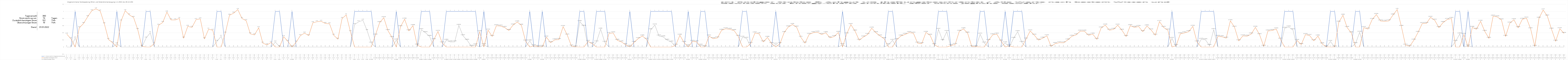
| Category | 1 = Strom reicht im Tagesdurchschnitt aus | Zusätzlich benötigter Strom | Überschüssiger Strom |
|---|---|---|---|
| 0 | 0 | 0.36 | 0 |
| 1 | 0 | 0.23 | 0 |
| 2 | 1 | 0 | 0.25 |
| 3 | 0 | 0.54 | 0 |
| 4 | 0 | 0.66 | 0 |
| 5 | 0 | 0.85 | 0 |
| 6 | 0 | 1.02 | 0 |
| 7 | 0 | 1.07 | 0 |
| 8 | 0 | 1.01 | 0 |
| 9 | 0 | 0.65 | 0 |
| 10 | 0 | 0.21 | 0 |
| 11 | 0 | 0.12 | 0 |
| 12 | 1 | 0 | 0.09 |
| 13 | 0 | 0.73 | 0 |
| 14 | 0 | 1.02 | 0 |
| 15 | 0 | 0.9 | 0 |
| 16 | 0 | 0.83 | 0 |
| 17 | 0 | 0.49 | 0 |
| 18 | 0 | 0.02 | 0 |
| 19 | 1 | 0 | 0.25 |
| 20 | 1 | 0 | 0.4 |
| 21 | 0 | 0.1 | 0 |
| 22 | 0 | 0.61 | 0 |
| 23 | 0 | 0.69 | 0 |
| 24 | 0 | 0.98 | 0 |
| 25 | 0 | 0.76 | 0 |
| 26 | 0 | 0.76 | 0 |
| 27 | 0 | 0.8 | 0 |
| 28 | 0 | 0.25 | 0 |
| 29 | 0 | 0.58 | 0 |
| 30 | 0 | 0.55 | 0 |
| 31 | 0 | 0.77 | 0 |
| 32 | 0 | 0.79 | 0 |
| 33 | 0 | 0.23 | 0 |
| 34 | 0 | 0.5 | 0 |
| 35 | 0 | 0.47 | 0 |
| 36 | 1 | 0 | 0.16 |
| 37 | 1 | 0 | 0.3 |
| 38 | 0 | 0.39 | 0 |
| 39 | 0 | 0.89 | 0 |
| 40 | 0 | 0.95 | 0 |
| 41 | 0 | 1.05 | 0 |
| 42 | 0 | 0.8 | 0 |
| 43 | 0 | 0.74 | 0 |
| 44 | 0 | 0.37 | 0 |
| 45 | 0 | 0.34 | 0 |
| 46 | 0 | 0.54 | 0 |
| 47 | 0 | 0.11 | 0 |
| 48 | 0 | 0.06 | 0 |
| 49 | 0 | 0.13 | 0 |
| 50 | 1 | 0 | 0.14 |
| 51 | 1 | 0 | 0.01 |
| 52 | 0 | 0.29 | 0 |
| 53 | 0 | 0.16 | 0 |
| 54 | 1 | 0 | 0 |
| 55 | 0 | 0.14 | 0 |
| 56 | 0 | 0.32 | 0 |
| 57 | 0 | 0.39 | 0 |
| 58 | 0 | 0.32 | 0 |
| 59 | 0 | 0.68 | 0 |
| 60 | 0 | 0.71 | 0 |
| 61 | 0 | 0.72 | 0 |
| 62 | 0 | 0.66 | 0 |
| 63 | 0 | 0.65 | 0 |
| 64 | 0 | 0.33 | 0 |
| 65 | 0 | 0.22 | 0 |
| 66 | 0 | 0.8 | 0 |
| 67 | 0 | 0.9 | 0 |
| 68 | 0 | 0.43 | 0 |
| 69 | 1 | 0 | 0.63 |
| 70 | 1 | 0 | 0.71 |
| 71 | 1 | 0 | 0.75 |
| 72 | 1 | 0 | 0.46 |
| 73 | 1 | 0 | 0.11 |
| 74 | 0 | 0.335 | 0 |
| 75 | 0 | 0.683 | 0 |
| 76 | 0 | 0.822 | 0 |
| 77 | 0 | 0.459 | 0 |
| 78 | 0 | 0.265 | 0 |
| 79 | 1 | 0 | 0.195 |
| 80 | 0 | 0.568 | 0 |
| 81 | 0 | 0.78 | 0 |
| 82 | 0 | 0.454 | 0 |
| 83 | 0 | 0.6 | 0 |
| 84 | 0 | 0.055 | 0 |
| 85 | 1 | 0 | 0.484 |
| 86 | 1 | 0 | 0.402 |
| 87 | 1 | 0 | 0.297 |
| 88 | 0 | 0.206 | 0 |
| 89 | 0 | 0.437 | 0 |
| 90 | 0 | 0.115 | 0 |
| 91 | 1 | 0 | 0.189 |
| 92 | 1 | 0 | 0.142 |
| 93 | 1 | 0 | 0.144 |
| 94 | 1 | 0 | 0.606 |
| 95 | 1 | 0 | 0.315 |
| 96 | 1 | 0 | 0.189 |
| 97 | 1 | 0 | 0.021 |
| 98 | 1 | 0 | 0.059 |
| 99 | 0 | 0.428 | 0 |
| 100 | 1 | 0 | 0.063 |
| 101 | 0 | 0.473 | 0 |
| 102 | 0 | 0.298 | 0 |
| 103 | 0 | 0.597 | 0 |
| 104 | 0 | 0.587 | 0 |
| 105 | 0 | 0.546 | 0 |
| 106 | 0 | 0.465 | 0 |
| 107 | 0 | 0.616 | 0 |
| 108 | 0 | 0.701 | 0 |
| 109 | 0 | 0.61 | 0 |
| 110 | 0 | 0.166 | 0 |
| 111 | 1 | 0 | 0.17 |
| 112 | 0 | 0.034 | 0 |
| 113 | 0 | 0.014 | 0 |
| 114 | 1 | 0 | 0.016 |
| 115 | 0 | 0.277 | 0 |
| 116 | 0 | 0.123 | 0 |
| 117 | 0 | 0.2 | 0 |
| 118 | 0 | 0.21 | 0 |
| 119 | 0 | 0.573 | 0 |
| 120 | 0 | 0.335 | 0 |
| 121 | 0 | 0.028 | 0 |
| 122 | 0 | 0.003 | 0 |
| 123 | 1 | 0 | 0.71 |
| 124 | 1 | 0 | 0.582 |
| 125 | 0 | 0.155 | 0 |
| 126 | 0 | 0.092 | 0 |
| 127 | 1 | 0 | 0.142 |
| 128 | 1 | 0 | 0.5 |
| 129 | 1 | 0 | 0.131 |
| 130 | 0 | 0.379 | 0 |
| 131 | 0 | 0.395 | 0 |
| 132 | 0 | 0.188 | 0 |
| 133 | 0 | 0.143 | 0 |
| 134 | 0 | 0.064 | 0 |
| 135 | 1 | 0 | 0.021 |
| 136 | 0 | 0.129 | 0 |
| 137 | 0 | 0.236 | 0 |
| 138 | 0 | 0.309 | 0 |
| 139 | 0 | 0.217 | 0 |
| 140 | 1 | 0 | 0.482 |
| 141 | 1 | 0 | 0.617 |
| 142 | 1 | 0 | 0.307 |
| 143 | 1 | 0 | 0.283 |
| 144 | 1 | 0 | 0.189 |
| 145 | 1 | 0 | 0.138 |
| 146 | 0 | 0.052 | 0 |
| 147 | 0 | 0.329 | 0 |
| 148 | 0 | 0.128 | 0 |
| 149 | 1 | 0 | 0.035 |
| 150 | 0 | 0.156 | 0 |
| 151 | 0 | 0.146 | 0 |
| 152 | 1 | 0 | 0.05 |
| 153 | 1 | 0 | 0.014 |
| 154 | 0 | 0.307 | 0 |
| 155 | 0 | 0.234 | 0 |
| 156 | 0 | 0.255 | 0 |
| 157 | 0 | 0.469 | 0 |
| 158 | 0 | 0.512 | 0 |
| 159 | 0 | 0.495 | 0 |
| 160 | 0 | 0.461 | 0 |
| 161 | 0 | 0.3 | 0 |
| 162 | 1 | 0 | 0.274 |
| 163 | 1 | 0 | 0.243 |
| 164 | 0 | 0.101 | 0 |
| 165 | 0 | 0.393 | 0 |
| 166 | 0 | 0.369 | 0 |
| 167 | 0 | 0.144 | 0 |
| 168 | 0 | 0.27 | 0 |
| 169 | 0 | 0.095 | 0 |
| 170 | 1 | 0 | 0.077 |
| 171 | 0 | 0.095 | 0 |
| 172 | 0 | 0.406 | 0 |
| 173 | 0 | 0.563 | 0 |
| 174 | 0 | 0.63 | 0 |
| 175 | 0 | 0.556 | 0 |
| 176 | 0 | 0.273 | 0 |
| 177 | 0 | 0.11 | 0 |
| 178 | 0 | 0.355 | 0 |
| 179 | 0 | 0.403 | 0 |
| 180 | 0 | 0.415 | 0 |
| 181 | 0 | 0.351 | 0 |
| 182 | 0 | 0.399 | 0 |
| 183 | 0 | 0.258 | 0 |
| 184 | 0 | 0.293 | 0 |
| 185 | 0 | 0.408 | 0 |
| 186 | 1 | 0 | 0.065 |
| 187 | 0 | 0.367 | 0 |
| 188 | 0 | 0.629 | 0 |
| 189 | 0 | 0.448 | 0 |
| 190 | 0 | 0.191 | 0 |
| 191 | 0 | 0.281 | 0 |
| 192 | 0 | 0.35 | 0 |
| 193 | 0 | 0.528 | 0 |
| 194 | 0 | 0.402 | 0 |
| 195 | 0 | 0.31 | 0 |
| 196 | 0 | 0.235 | 0 |
| 197 | 1 | 0 | 0.063 |
| 198 | 1 | 0 | 0.187 |
| 199 | 0 | 0.206 | 0 |
| 200 | 0 | 0.309 | 0 |
| 201 | 0 | 0.354 | 0 |
| 202 | 0 | 0.404 | 0 |
| 203 | 0 | 0.388 | 0 |
| 204 | 0 | 0.11 | 0 |
| 205 | 0 | 0.093 | 0 |
| 206 | 0 | 0.41 | 0 |
| 207 | 0 | 0.329 | 0 |
| 208 | 0 | 0.066 | 0 |
| 209 | 1 | 0 | 0.493 |
| 210 | 1 | 0 | 0.182 |
| 211 | 1 | 0 | 0.433 |
| 212 | 0 | 0.042 | 0 |
| 213 | 0 | 0.071 | 0 |
| 214 | 0 | 0.441 | 0 |
| 215 | 0 | 0.51 | 0 |
| 216 | 0 | 0.389 | 0 |
| 217 | 0 | 0.012 | 0 |
| 218 | 0 | 0.011 | 0 |
| 219 | 1 | 0 | 0.358 |
| 220 | 1 | 0 | 0.112 |
| 221 | 0 | 0.184 | 0 |
| 222 | 0 | 0.34 | 0 |
| 223 | 0 | 0.36 | 0 |
| 224 | 0 | 0.168 | 0 |
| 225 | 1 | 0 | 0.116 |
| 226 | 0 | 0.036 | 0 |
| 227 | 1 | 0 | 0.242 |
| 228 | 1 | 0 | 0.43 |
| 229 | 1 | 0 | 0.129 |
| 230 | 0 | 0.223 | 0 |
| 231 | 0 | 0.451 | 0 |
| 232 | 0 | 0.331 | 0 |
| 233 | 0 | 0.194 | 0 |
| 234 | 0 | 0.249 | 0 |
| 235 | 0 | 0.314 | 0 |
| 236 | 0 | 0.019 | 0 |
| 237 | 0 | 0.095 | 0 |
| 238 | 0 | 0.122 | 0 |
| 239 | 0 | 0.118 | 0 |
| 240 | 0 | 0.198 | 0 |
| 241 | 0 | 0.302 | 0 |
| 242 | 0 | 0.341 | 0 |
| 243 | 0 | 0.444 | 0 |
| 244 | 0 | 0.445 | 0 |
| 245 | 0 | 0.329 | 0 |
| 246 | 0 | 0.361 | 0 |
| 247 | 0 | 0.216 | 0 |
| 248 | 0 | 0.534 | 0 |
| 249 | 0 | 0.615 | 0 |
| 250 | 0 | 0.472 | 0 |
| 251 | 0 | 0.495 | 0 |
| 252 | 0 | 0.613 | 0 |
| 253 | 0 | 0.47 | 0 |
| 254 | 0 | 0.296 | 0 |
| 255 | 0 | 0.6 | 0 |
| 256 | 0 | 0.55 | 0 |
| 257 | 0 | 0.576 | 0 |
| 258 | 0 | 0.432 | 0 |
| 259 | 0 | 0.59 | 0 |
| 260 | 0 | 0.477 | 0 |
| 261 | 0 | 0.331 | 0 |
| 262 | 0 | 0.714 | 0 |
| 263 | 0 | 0.548 | 0 |
| 264 | 0 | 0.476 | 0 |
| 265 | 1 | 0 | 0.242 |
| 266 | 0 | 0.041 | 0 |
| 267 | 0 | 0.369 | 0 |
| 268 | 0 | 0.396 | 0 |
| 269 | 0 | 0.43 | 0 |
| 270 | 0 | 0.579 | 0 |
| 271 | 0 | 0.143 | 0 |
| 272 | 1 | 0 | 0.215 |
| 273 | 1 | 0 | 0.205 |
| 274 | 1 | 0 | 0.042 |
| 275 | 1 | 0 | 0.487 |
| 276 | 0 | 0.297 | 0 |
| 277 | 0 | 0.287 | 0 |
| 278 | 0 | 0.249 | 0 |
| 279 | 0 | 0.736 | 0 |
| 280 | 0 | 0.554 | 0 |
| 281 | 0 | 0.174 | 0 |
| 282 | 0 | 0.313 | 0 |
| 283 | 0 | 0.303 | 0 |
| 284 | 0 | 0.365 | 0 |
| 285 | 0 | 0.552 | 0 |
| 286 | 0 | 0.346 | 0 |
| 287 | 0 | 0.022 | 0 |
| 288 | 0 | 0.449 | 0 |
| 289 | 0 | 0.462 | 0 |
| 290 | 0 | 0.506 | 0 |
| 291 | 0 | 0.219 | 0 |
| 292 | 1 | 0 | 0.525 |
| 293 | 1 | 0 | 0.56 |
| 294 | 1 | 0 | 0.482 |
| 295 | 0 | 0.183 | 0 |
| 296 | 0 | 0.07 | 0 |
| 297 | 0 | 0.347 | 0 |
| 298 | 0 | 0.322 | 0 |
| 299 | 0 | 0.176 | 0 |
| 300 | 0 | 0.307 | 0 |
| 301 | 0 | 0.088 | 0 |
| 302 | 0 | 0.004 | 0 |
| 303 | 1 | 0 | 0.154 |
| 304 | 1 | 0 | 0 |
| 305 | 0 | 0.696 | 0 |
| 306 | 0 | 0.891 | 0 |
| 307 | 0 | 0.545 | 0 |
| 308 | 0 | 0.397 | 0 |
| 309 | 1 | 0 | 0.095 |
| 310 | 1 | 0 | 0.413 |
| 311 | 0 | 0.542 | 0 |
| 312 | 0 | 0.503 | 0 |
| 313 | 0 | 0.771 | 0 |
| 314 | 0 | 0.911 | 0 |
| 315 | 0 | 0.73 | 0 |
| 316 | 0 | 0.72 | 0 |
| 317 | 0 | 0.733 | 0 |
| 318 | 0 | 0.898 | 0 |
| 319 | 0 | 1.051 | 0 |
| 320 | 0 | 0.577 | 0 |
| 321 | 0 | 0.051 | 0 |
| 322 | 0 | 0.022 | 0 |
| 323 | 0 | 0.193 | 0 |
| 324 | 0 | 0.41 | 0 |
| 325 | 0 | 0.658 | 0 |
| 326 | 0 | 0.661 | 0 |
| 327 | 0 | 0.832 | 0 |
| 328 | 0 | 0.752 | 0 |
| 329 | 0 | 0.544 | 0 |
| 330 | 0 | 0.686 | 0 |
| 331 | 0 | 0.772 | 0 |
| 332 | 0 | 0.8 | 0 |
| 333 | 1 | 0 | 0.157 |
| 334 | 1 | 0 | 0.366 |
| 335 | 0 | 0.354 | 0 |
| 336 | 1 | 0 | 0.028 |
| 337 | 0 | 0.549 | 0 |
| 338 | 0 | 0.499 | 0 |
| 339 | 0 | 0.721 | 0 |
| 340 | 0 | 0.439 | 0 |
| 341 | 0 | 0.244 | 0 |
| 342 | 0 | 0.864 | 0 |
| 343 | 0 | 0.844 | 0 |
| 344 | 0 | 0.761 | 0 |
| 345 | 0 | 0.299 | 0 |
| 346 | 0 | 0.67 | 0 |
| 347 | 0 | 0.765 | 0 |
| 348 | 0 | 0.541 | 0 |
| 349 | 0 | 0.777 | 0 |
| 350 | 0 | 0.811 | 0 |
| 351 | 0 | 0.508 | 0 |
| 352 | 0 | 0.018 | 0 |
| 353 | 0 | 0.807 | 0 |
| 354 | 0 | 1.038 | 0 |
| 355 | 0 | 0.868 | 0 |
| 356 | 0 | 0.5 | 0 |
| 357 | 0 | 0.163 | 0 |
| 358 | 0 | 0.513 | 0 |
| 359 | 0 | 0.382 | 0 |